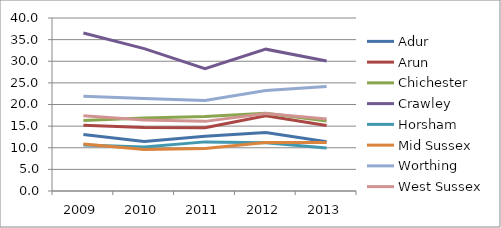
| Category | Adur | Arun | Chichester | Crawley | Horsham | Mid Sussex | Worthing | West Sussex |
|---|---|---|---|---|---|---|---|---|
| 2009.0 | 13.06 | 15.206 | 16.299 | 36.524 | 10.651 | 10.843 | 21.905 | 17.391 |
| 2010.0 | 11.462 | 14.665 | 16.852 | 32.909 | 10.187 | 9.594 | 21.41 | 16.413 |
| 2011.0 | 12.685 | 14.605 | 17.238 | 28.285 | 11.358 | 9.808 | 20.915 | 16.1 |
| 2012.0 | 13.532 | 17.369 | 17.948 | 32.797 | 11.168 | 11.235 | 23.229 | 17.891 |
| 2013.0 | 11.364 | 15.132 | 16.194 | 30.041 | 9.936 | 11.242 | 24.153 | 16.621 |